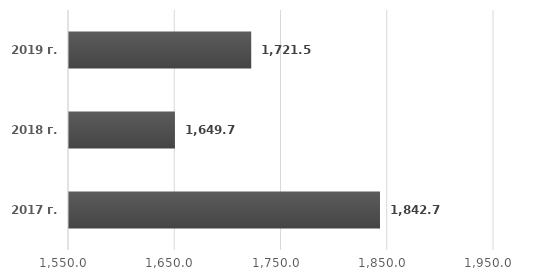
| Category | Series 0 |
|---|---|
| 2017 г. | 1842.7 |
| 2018 г. | 1649.7 |
| 2019 г. | 1721.5 |